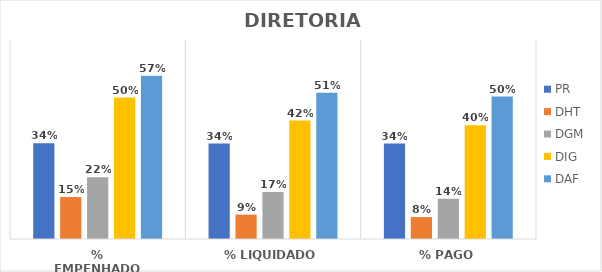
| Category | PR | DHT | DGM | DIG | DAF |
|---|---|---|---|---|---|
| % EMPENHADO | 0.337 | 0.148 | 0.217 | 0.497 | 0.575 |
| % LIQUIDADO | 0.336 | 0.086 | 0.165 | 0.417 | 0.515 |
| % PAGO | 0.336 | 0.077 | 0.142 | 0.4 | 0.501 |